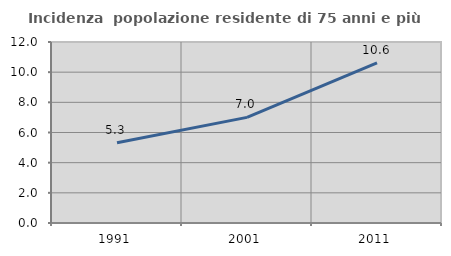
| Category | Incidenza  popolazione residente di 75 anni e più |
|---|---|
| 1991.0 | 5.315 |
| 2001.0 | 7.004 |
| 2011.0 | 10.618 |